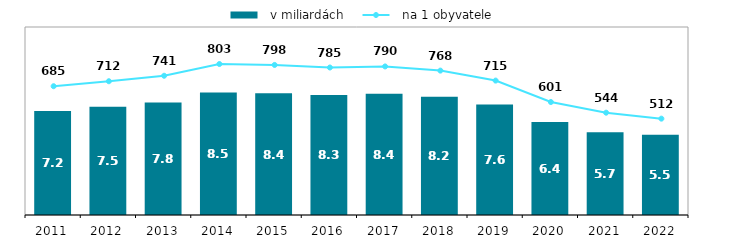
| Category |   v miliardách |
|---|---|
| 2011.0 | 7.196 |
| 2012.0 | 7.483 |
| 2013.0 | 7.786 |
| 2014.0 | 8.463 |
| 2015.0 | 8.424 |
| 2016.0 | 8.3 |
| 2017.0 | 8.385 |
| 2018.0 | 8.179 |
| 2019.0 | 7.646 |
| 2020.0 | 6.431 |
| 2021.0 | 5.724 |
| 2022.0 | 5.549 |